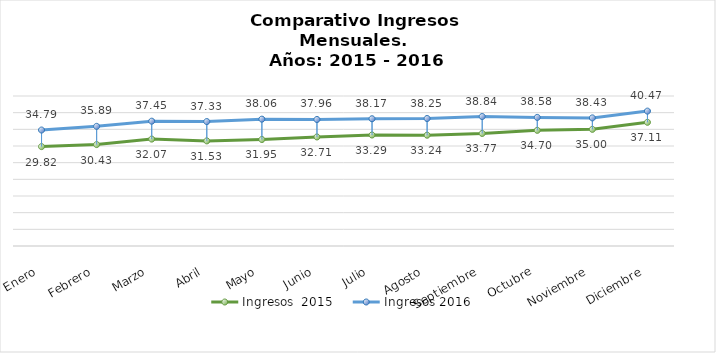
| Category | Ingresos  2015 | Ingresos 2016 |
|---|---|---|
| Enero | 29.817 | 34.786 |
| Febrero | 30.426 | 35.892 |
| Marzo | 32.071 | 37.447 |
| Abril | 31.53 | 37.327 |
| Mayo | 31.951 | 38.057 |
| Junio | 32.712 | 37.955 |
| Julio | 33.292 | 38.173 |
| Agosto | 33.24 | 38.248 |
| Septiembre | 33.766 | 38.844 |
| Octubre | 34.699 | 38.581 |
| Noviembre | 34.997 | 38.43 |
| Diciembre | 37.106 | 40.466 |